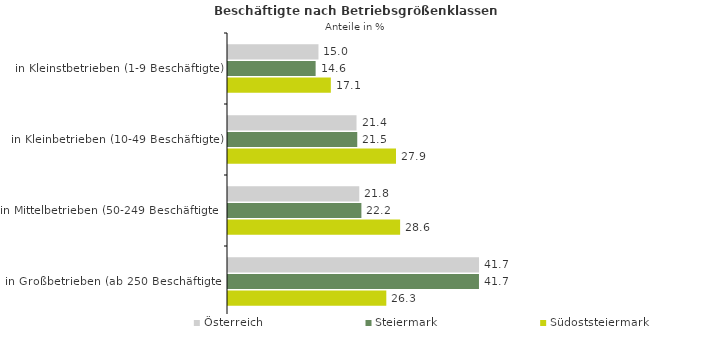
| Category | Österreich | Steiermark | Südoststeiermark |
|---|---|---|---|
| in Kleinstbetrieben (1-9 Beschäftigte) | 15.046 | 14.574 | 17.104 |
| in Kleinbetrieben (10-49 Beschäftigte) | 21.375 | 21.498 | 27.94 |
| in Mittelbetrieben (50-249 Beschäftigte) | 21.831 | 22.187 | 28.627 |
| in Großbetrieben (ab 250 Beschäftigte) | 41.748 | 41.742 | 26.33 |